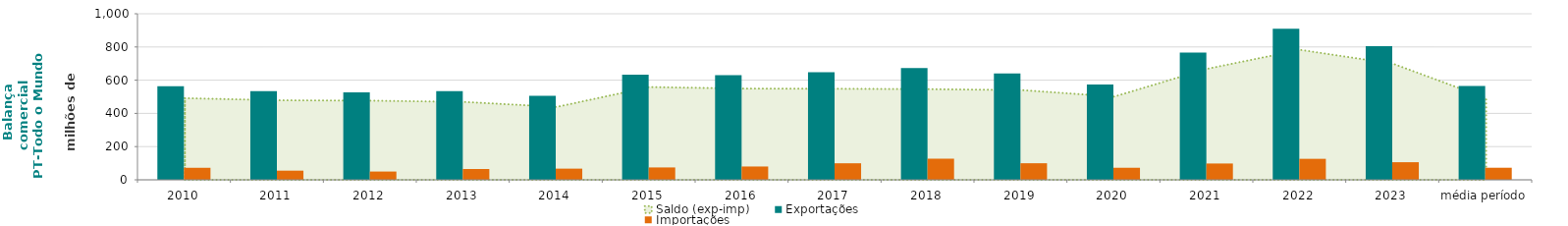
| Category | Exportações  | Importações  |
|---|---|---|
| 2010 | 564.035 | 72.422 |
| 2011 | 534.142 | 55.21 |
| 2012 | 526.514 | 49.867 |
| 2013 | 534.274 | 65.216 |
| 2014 | 506.348 | 67.339 |
| 2015 | 633.121 | 74.48 |
| 2016 | 629.75 | 80.191 |
| 2017 | 647.86 | 99.579 |
| 2018 | 673.268 | 127.266 |
| 2019 | 640.054 | 99.789 |
| 2020 | 573.785 | 72.597 |
| 2021 | 766.939 | 98.213 |
| 2022 | 909.045 | 126.449 |
| 2023 | 804.78 | 106.015 |
| média período | 565.001 | 72.744 |